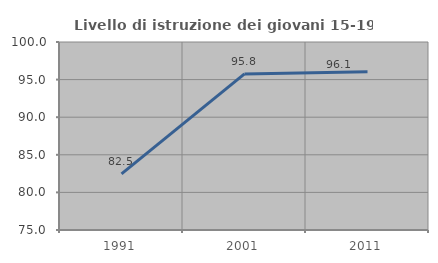
| Category | Livello di istruzione dei giovani 15-19 anni |
|---|---|
| 1991.0 | 82.456 |
| 2001.0 | 95.75 |
| 2011.0 | 96.053 |